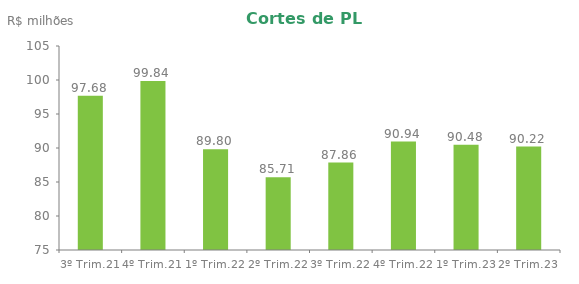
| Category | Series 0 |
|---|---|
| 3º Trim.21 | 97.678 |
| 4º Trim.21 | 99.84 |
| 1º Trim.22 | 89.798 |
| 2º Trim.22 | 85.707 |
| 3º Trim.22 | 87.86 |
| 4º Trim.22 | 90.94 |
| 1º Trim.23 | 90.48 |
| 2º Trim.23 | 90.22 |